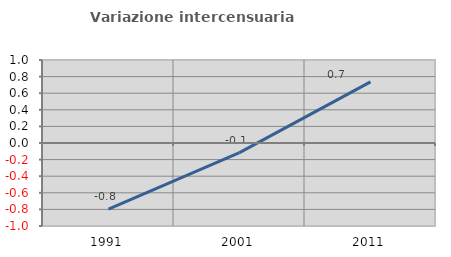
| Category | Variazione intercensuaria annua |
|---|---|
| 1991.0 | -0.796 |
| 2001.0 | -0.116 |
| 2011.0 | 0.736 |